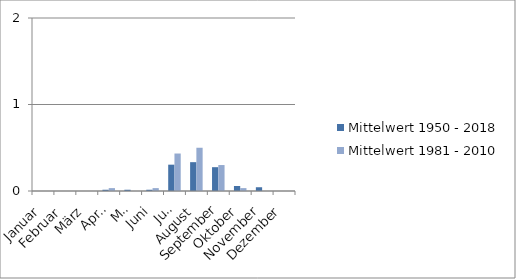
| Category | Mittelwert 1950 - 2018 | Mittelwert 1981 - 2010 |
|---|---|---|
| Januar | 0 | 0 |
| Februar | 0 | 0 |
| März | 0 | 0 |
| April | 0.014 | 0.033 |
| Mai | 0.014 | 0 |
| Juni | 0.014 | 0.033 |
| Juli | 0.304 | 0.433 |
| August | 0.333 | 0.5 |
| September | 0.275 | 0.3 |
| Oktober | 0.058 | 0.033 |
| November | 0.043 | 0 |
| Dezember | 0 | 0 |